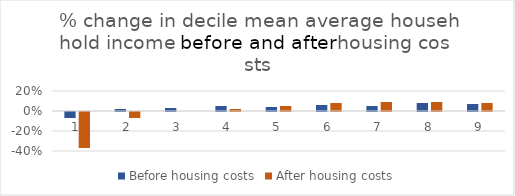
| Category | Before housing costs | After housing costs |
|---|---|---|
| 0 | -0.06 | -0.36 |
| 1 | 0.02 | -0.06 |
| 2 | 0.03 | 0 |
| 3 | 0.05 | 0.02 |
| 4 | 0.04 | 0.05 |
| 5 | 0.06 | 0.08 |
| 6 | 0.05 | 0.09 |
| 7 | 0.08 | 0.09 |
| 8 | 0.07 | 0.08 |